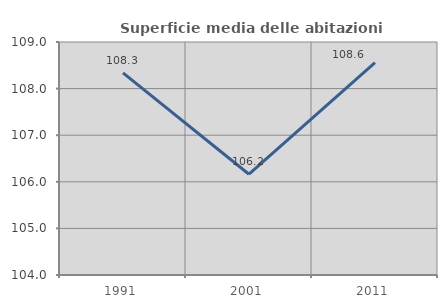
| Category | Superficie media delle abitazioni occupate |
|---|---|
| 1991.0 | 108.338 |
| 2001.0 | 106.163 |
| 2011.0 | 108.557 |